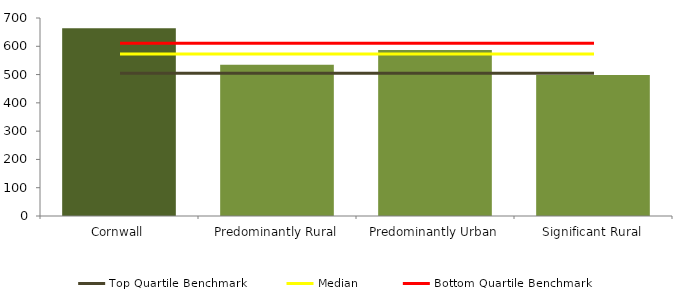
| Category | Series 0 |
|---|---|
| Cornwall | 663.4 |
| Predominantly Rural | 534.945 |
| Predominantly Urban | 586.711 |
| Significant Rural | 498.35 |